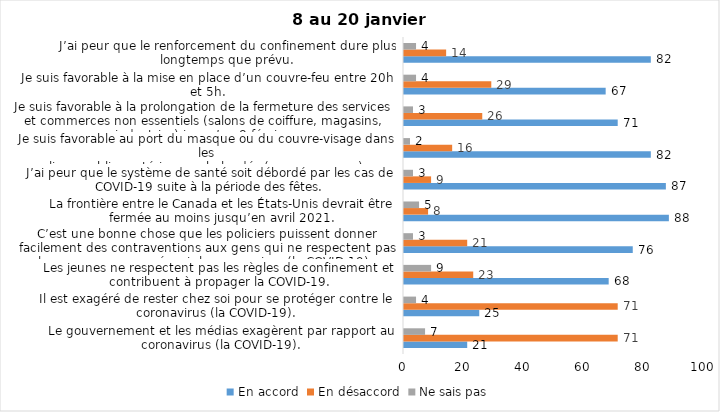
| Category | En accord | En désaccord | Ne sais pas |
|---|---|---|---|
| Le gouvernement et les médias exagèrent par rapport au coronavirus (la COVID-19). | 21 | 71 | 7 |
| Il est exagéré de rester chez soi pour se protéger contre le coronavirus (la COVID-19). | 25 | 71 | 4 |
| Les jeunes ne respectent pas les règles de confinement et contribuent à propager la COVID-19. | 68 | 23 | 9 |
| C’est une bonne chose que les policiers puissent donner facilement des contraventions aux gens qui ne respectent pas les mesures pour prévenir le coronavirus (la COVID-19). | 76 | 21 | 3 |
| La frontière entre le Canada et les États-Unis devrait être fermée au moins jusqu’en avril 2021. | 88 | 8 | 5 |
| J’ai peur que le système de santé soit débordé par les cas de COVID-19 suite à la période des fêtes. | 87 | 9 | 3 |
| Je suis favorable au port du masque ou du couvre-visage dans les
lieux publics extérieurs achalandés (ex. rues, parcs) | 82 | 16 | 2 |
| Je suis favorable à la prolongation de la fermeture des services et commerces non essentiels (salons de coiffure, magasins, industries) jusqu’au 8 février. | 71 | 26 | 3 |
| Je suis favorable à la mise en place d’un couvre-feu entre 20h et 5h. | 67 | 29 | 4 |
| J’ai peur que le renforcement du confinement dure plus longtemps que prévu. | 82 | 14 | 4 |